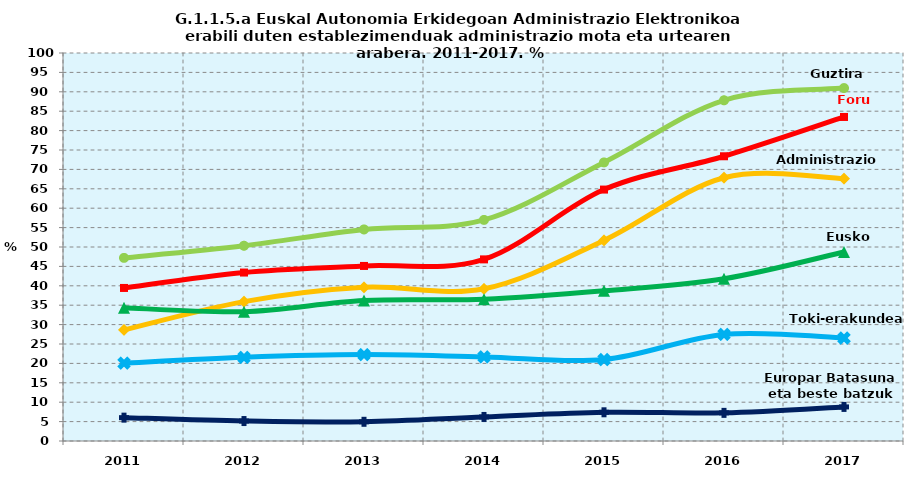
| Category | Guztira | Foru aldundiak | Administrazio Zentrala | Eusko Jaurlaritza | Toki-erakundeak | Europar Batasuna eta beste batzuk |
|---|---|---|---|---|---|---|
| 2011.0 | 47.195 | 39.446 | 28.619 | 34.347 | 20.063 | 6.017 |
| 2012.0 | 50.321 | 43.417 | 35.926 | 33.339 | 21.568 | 5.144 |
| 2013.0 | 54.524 | 45.118 | 39.622 | 36.207 | 22.264 | 4.948 |
| 2014.0 | 56.986 | 46.807 | 39.221 | 36.539 | 21.658 | 6.198 |
| 2015.0 | 71.8 | 64.8 | 51.7 | 38.7 | 21 | 7.4 |
| 2016.0 | 87.813 | 73.385 | 67.853 | 41.82 | 27.461 | 7.249 |
| 2017.0 | 90.959 | 83.514 | 67.612 | 48.718 | 26.543 | 8.784 |